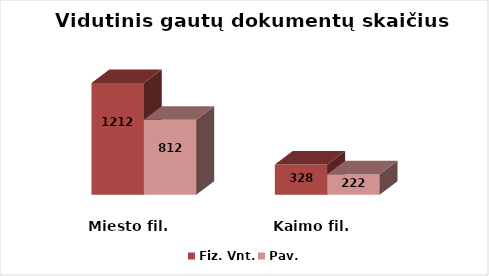
| Category | Fiz. Vnt. | Pav. |
|---|---|---|
| Miesto fil. | 1212 | 812.4 |
| Kaimo fil. | 327.6 | 221.9 |